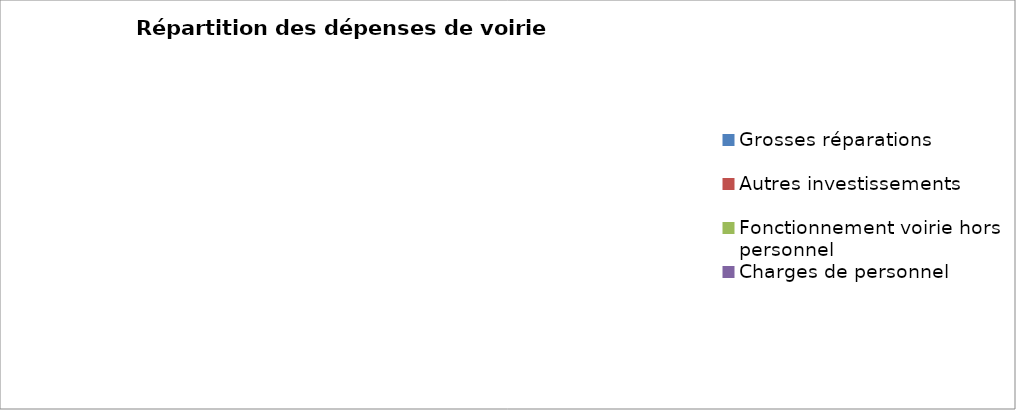
| Category | Series 0 |
|---|---|
| Grosses réparations | 0 |
| Autres investissements | 0 |
| Fonctionnement voirie hors personnel | 0 |
| Charges de personnel | 0 |